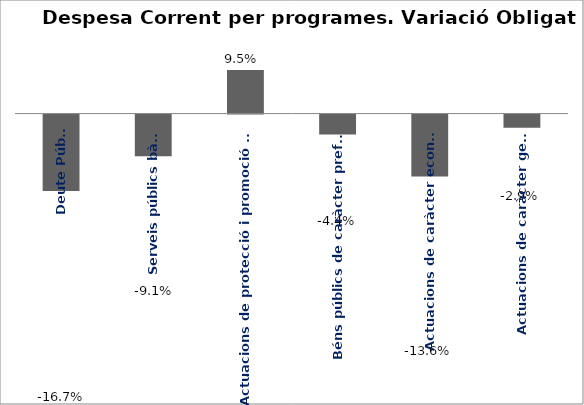
| Category | Series 0 |
|---|---|
| Deute Públic | -0.167 |
| Serveis públics bàsics | -0.091 |
| Actuacions de protecció i promoció social | 0.095 |
| Béns públics de caràcter preferent | -0.044 |
| Actuacions de caràcter econòmic | -0.136 |
| Actuacions de caràcter general | -0.029 |